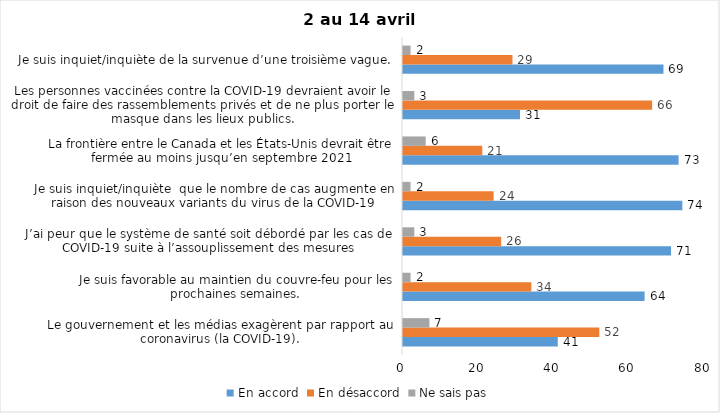
| Category | En accord | En désaccord | Ne sais pas |
|---|---|---|---|
| Le gouvernement et les médias exagèrent par rapport au coronavirus (la COVID-19). | 41 | 52 | 7 |
| Je suis favorable au maintien du couvre-feu pour les prochaines semaines. | 64 | 34 | 2 |
| J’ai peur que le système de santé soit débordé par les cas de COVID-19 suite à l’assouplissement des mesures | 71 | 26 | 3 |
| Je suis inquiet/inquiète  que le nombre de cas augmente en raison des nouveaux variants du virus de la COVID-19 | 74 | 24 | 2 |
| La frontière entre le Canada et les États-Unis devrait être fermée au moins jusqu’en septembre 2021 | 73 | 21 | 6 |
| Les personnes vaccinées contre la COVID-19 devraient avoir le droit de faire des rassemblements privés et de ne plus porter le masque dans les lieux publics. | 31 | 66 | 3 |
| Je suis inquiet/inquiète de la survenue d’une troisième vague. | 69 | 29 | 2 |